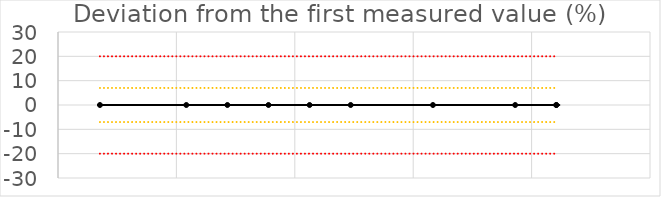
| Category | Abweichung 1. Messung |
|---|---|
| 43594.37708333333 | 0 |
| 43594.39166666667 | 0 |
| 43594.39861111111 | -0.001 |
| 43594.40555555555 | -0.001 |
| 43594.4125 | -0.002 |
| 43594.419444444444 | -0.003 |
| 43594.433333333334 | -0.003 |
| 43594.447222222225 | -0.004 |
| 43594.45416666667 | -0.004 |
| 43594.45416666667 | -0.004 |
| nan | 0 |
| nan | 0 |
| nan | 0 |
| nan | 0 |
| nan | 0 |
| nan | 0 |
| nan | 0 |
| nan | 0 |
| nan | 0 |
| nan | 0 |
| nan | 0 |
| nan | 0 |
| nan | 0 |
| nan | 0 |
| nan | 0 |
| nan | 0 |
| nan | 0 |
| nan | 0 |
| nan | 0 |
| nan | 0 |
| nan | 0 |
| nan | 0 |
| nan | 0 |
| nan | 0 |
| nan | 0 |
| nan | 0 |
| nan | 0 |
| nan | 0 |
| nan | 0 |
| nan | 0 |
| nan | 0 |
| nan | 0 |
| nan | 0 |
| nan | 0 |
| nan | 0 |
| nan | 0 |
| nan | 0 |
| nan | 0 |
| nan | 0 |
| nan | 0 |
| nan | 0 |
| nan | 0 |
| nan | 0 |
| nan | 0 |
| nan | 0 |
| nan | 0 |
| nan | 0 |
| nan | 0 |
| nan | 0 |
| nan | 0 |
| nan | 0 |
| nan | 0 |
| nan | 0 |
| nan | 0 |
| nan | 0 |
| nan | 0 |
| nan | 0 |
| nan | 0 |
| nan | 0 |
| nan | 0 |
| nan | 0 |
| nan | 0 |
| nan | 0 |
| nan | 0 |
| nan | 0 |
| nan | 0 |
| nan | 0 |
| nan | 0 |
| nan | 0 |
| nan | 0 |
| nan | 0 |
| nan | 0 |
| nan | 0 |
| nan | 0 |
| nan | 0 |
| nan | 0 |
| nan | 0 |
| nan | 0 |
| nan | 0 |
| nan | 0 |
| nan | 0 |
| nan | 0 |
| nan | 0 |
| nan | 0 |
| nan | 0 |
| nan | 0 |
| nan | 0 |
| nan | 0 |
| nan | 0 |
| nan | 0 |